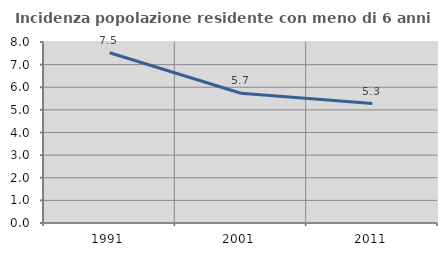
| Category | Incidenza popolazione residente con meno di 6 anni |
|---|---|
| 1991.0 | 7.526 |
| 2001.0 | 5.736 |
| 2011.0 | 5.277 |